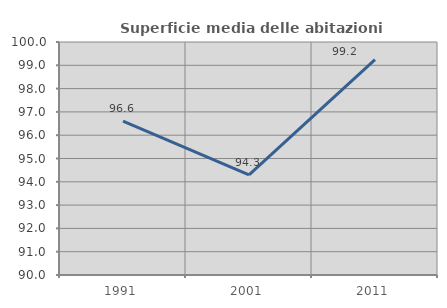
| Category | Superficie media delle abitazioni occupate |
|---|---|
| 1991.0 | 96.604 |
| 2001.0 | 94.301 |
| 2011.0 | 99.246 |